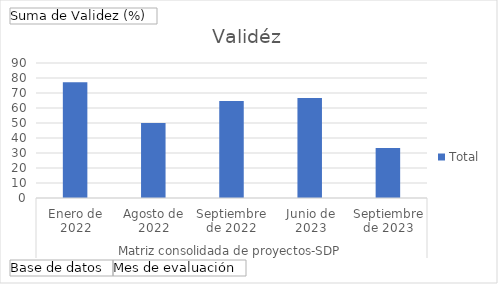
| Category | Total |
|---|---|
| 0 | 77.14 |
| 1 | 50 |
| 2 | 64.71 |
| 3 | 66.67 |
| 4 | 33.33 |